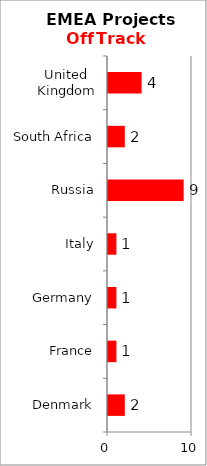
| Category | Total |
|---|---|
| Denmark | 2 |
| France | 1 |
| Germany | 1 |
| Italy | 1 |
| Russia | 9 |
| South Africa | 2 |
| United Kingdom | 4 |